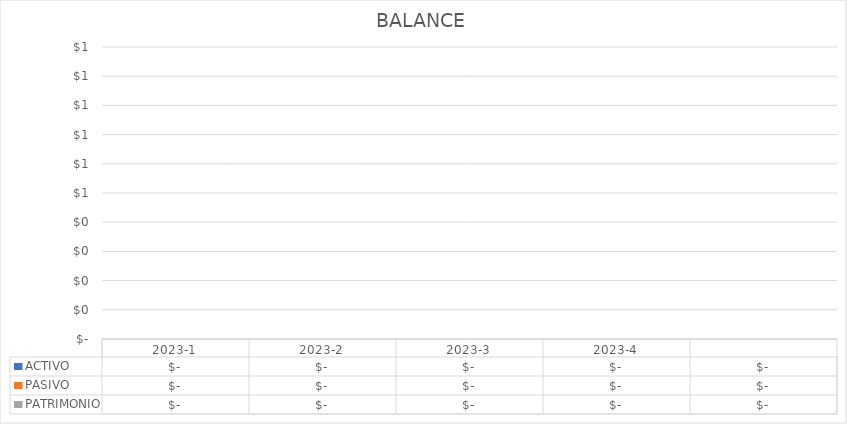
| Category | ACTIVO  | PASIVO  | PATRIMONIO |
|---|---|---|---|
| 2023-1 | 0 | 0 | 0 |
| 2023-2 | 0 | 0 | 0 |
| 2023-3 | 0 | 0 | 0 |
| 2023-4 | 0 | 0 | 0 |